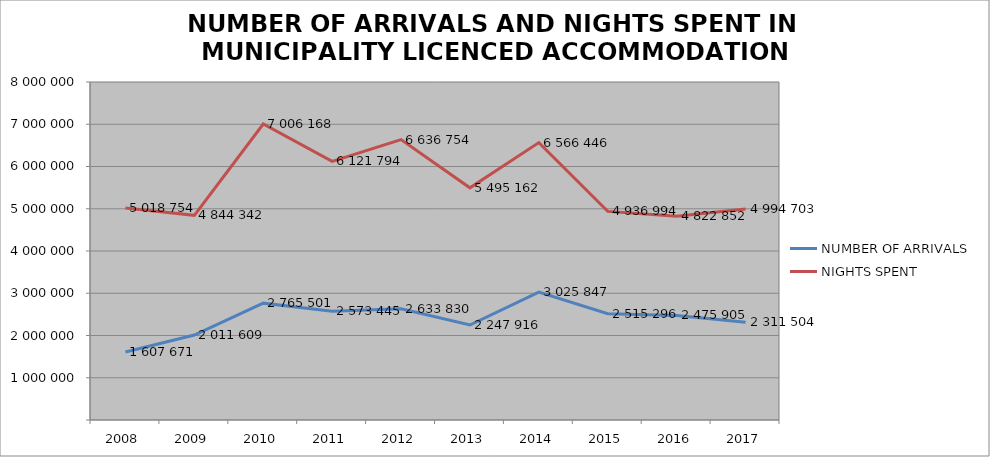
| Category | NUMBER OF ARRIVALS | NIGHTS SPENT |
|---|---|---|
| 2008 | 1607671 | 5018754 |
| 2009 | 2011609 | 4844342 |
| 2010 | 2765501 | 7006168 |
| 2011 | 2573445 | 6121794 |
| 2012 | 2633830 | 6636754 |
| 2013 | 2247916 | 5495162 |
| 2014 | 3025847 | 6566446 |
| 2015 | 2515296 | 4936994 |
| 2016 | 2475905 | 4822852 |
| 2017 | 2311504 | 4994703 |